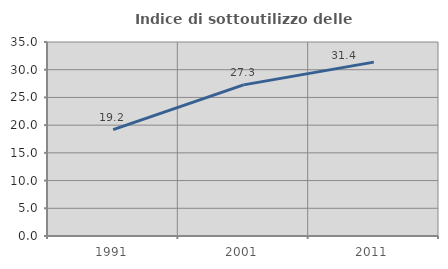
| Category | Indice di sottoutilizzo delle abitazioni  |
|---|---|
| 1991.0 | 19.185 |
| 2001.0 | 27.269 |
| 2011.0 | 31.366 |